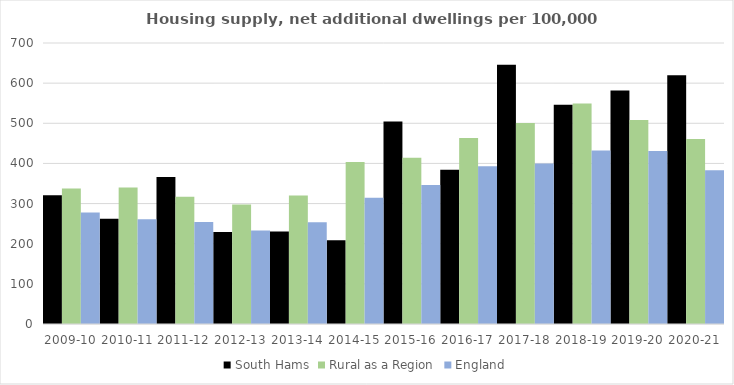
| Category | South Hams | Rural as a Region | England |
|---|---|---|---|
| 2009-10 | 320.507 | 337.852 | 277.548 |
| 2010-11 | 262.465 | 340.105 | 260.994 |
| 2011-12 | 366.191 | 317.04 | 254.007 |
| 2012-13 | 229.382 | 297.763 | 233.153 |
| 2013-14 | 230.645 | 319.835 | 253.602 |
| 2014-15 | 208.444 | 403.796 | 314.256 |
| 2015-16 | 504.206 | 414.091 | 346.154 |
| 2016-17 | 384.28 | 463.209 | 393.256 |
| 2017-18 | 645.653 | 500.68 | 399.646 |
| 2018-19 | 546.271 | 549.491 | 432.099 |
| 2019-20 | 581.582 | 508.493 | 431.187 |
| 2020-21 | 619.698 | 461.114 | 382.827 |